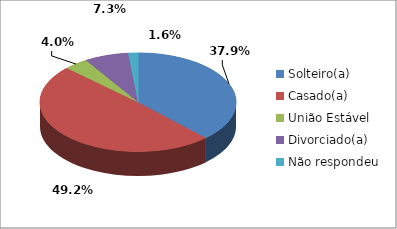
| Category | Series 0 |
|---|---|
| Solteiro(a) | 47 |
| Casado(a) | 61 |
| União Estável | 5 |
| Divorciado(a) | 9 |
| Não respondeu | 2 |